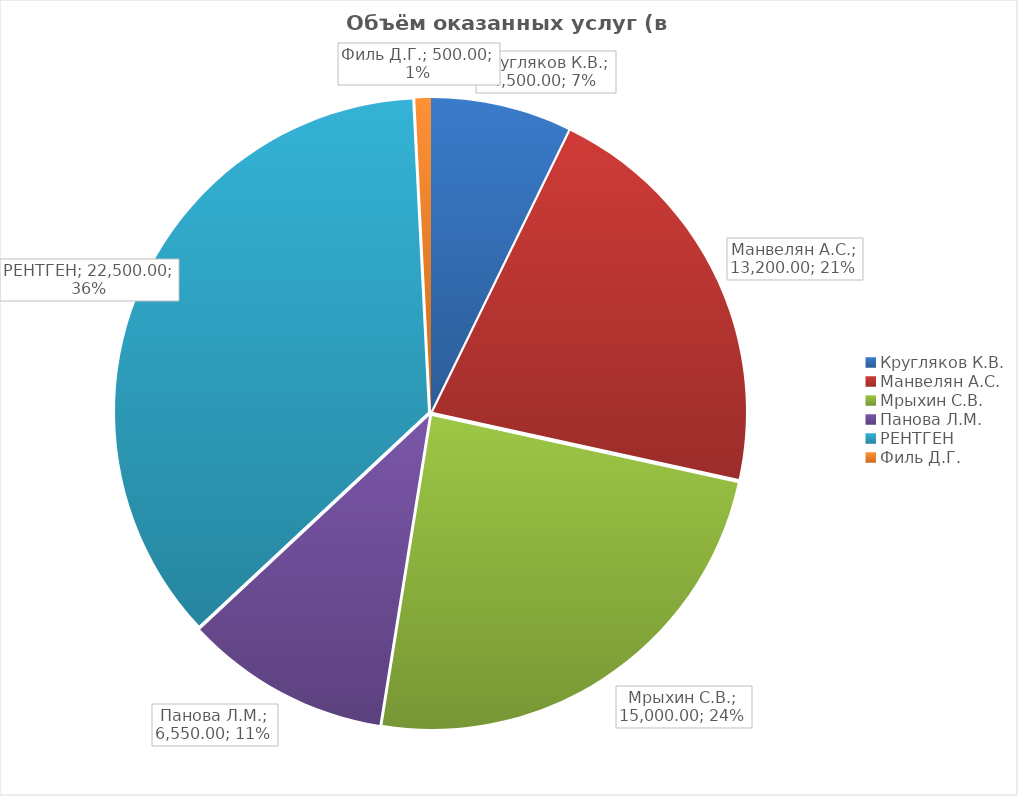
| Category | Объём оказанных услуг (в руб.) | Доля в общем объёме выручки (в %) |
|---|---|---|
| Кругляков К.В. | 4500 | 0.072 |
| Манвелян А.С. | 13200 | 0.212 |
| Мрыхин С.В. | 15000 | 0.241 |
| Панова Л.М. | 6550 | 0.105 |
| РЕНТГЕН | 22500 | 0.361 |
| Филь Д.Г. | 500 | 0.008 |